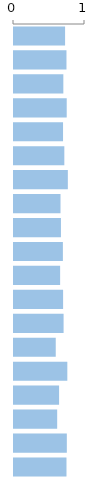
| Category | Score |
|---|---|
| 0 | 0.72 |
| 1 | 0.739 |
| 2 | 0.695 |
| 3 | 0.742 |
| 4 | 0.691 |
| 5 | 0.709 |
| 6 | 0.758 |
| 7 | 0.655 |
| 8 | 0.661 |
| 9 | 0.688 |
| 10 | 0.65 |
| 11 | 0.692 |
| 12 | 0.698 |
| 13 | 0.588 |
| 14 | 0.751 |
| 15 | 0.635 |
| 16 | 0.608 |
| 17 | 0.744 |
| 18 | 0.739 |